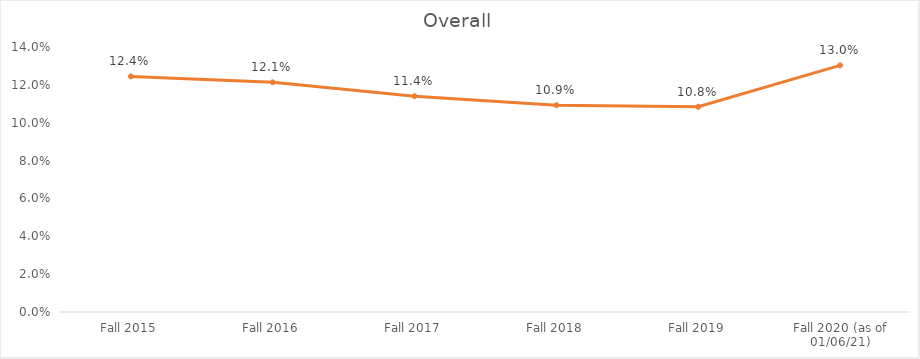
| Category | Series 0 |
|---|---|
| Fall 2015 | 0.124 |
| Fall 2016 | 0.121 |
| Fall 2017 | 0.114 |
| Fall 2018 | 0.109 |
| Fall 2019 | 0.108 |
| Fall 2020 (as of 01/06/21) | 0.13 |